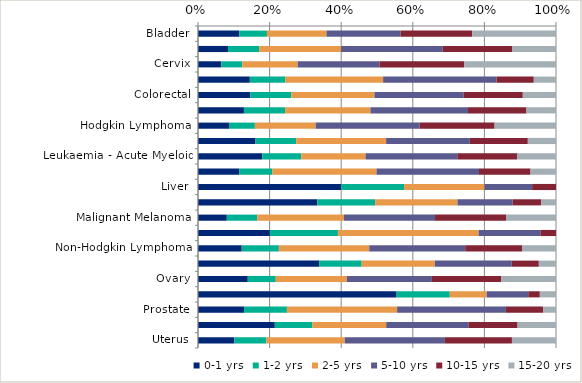
| Category | 0-1 yrs | 1-2 yrs | 2-5 yrs | 5-10 yrs | 10-15 yrs | 15-20 yrs |
|---|---|---|---|---|---|---|
| Bladder | 0.115 | 0.077 | 0.166 | 0.207 | 0.2 | 0.234 |
| Breast | 0.084 | 0.088 | 0.228 | 0.284 | 0.193 | 0.123 |
| Cervix | 0.065 | 0.059 | 0.155 | 0.228 | 0.237 | 0.256 |
| Central Nervous System (including Brain) | 0.145 | 0.099 | 0.273 | 0.317 | 0.104 | 0.062 |
| Colorectal | 0.146 | 0.115 | 0.232 | 0.249 | 0.165 | 0.093 |
| Head and Neck | 0.128 | 0.115 | 0.239 | 0.273 | 0.163 | 0.082 |
| Hodgkin Lymphoma | 0.087 | 0.072 | 0.17 | 0.291 | 0.209 | 0.171 |
| Kidney and unspecified urinary organs | 0.161 | 0.114 | 0.251 | 0.234 | 0.162 | 0.079 |
| Leukaemia - Acute Myeloid | 0.179 | 0.109 | 0.179 | 0.256 | 0.167 | 0.109 |
| Leukaemia - Chronic Lymphocytic | 0.115 | 0.093 | 0.291 | 0.286 | 0.144 | 0.071 |
| Liver | 0.4 | 0.176 | 0.224 | 0.133 | 0.067 | 0 |
| Lung | 0.333 | 0.162 | 0.23 | 0.154 | 0.08 | 0.041 |
| Malignant Melanoma | 0.08 | 0.085 | 0.242 | 0.255 | 0.199 | 0.138 |
| Multiple Myeloma | 0.201 | 0.19 | 0.393 | 0.172 | 0.044 | 0 |
| Non-Hodgkin Lymphoma | 0.122 | 0.104 | 0.253 | 0.268 | 0.159 | 0.095 |
| Oesophagus | 0.338 | 0.119 | 0.205 | 0.215 | 0.076 | 0.048 |
| Ovary | 0.139 | 0.078 | 0.199 | 0.237 | 0.193 | 0.153 |
| Pancreas | 0.555 | 0.148 | 0.103 | 0.116 | 0.032 | 0.045 |
| Prostate | 0.129 | 0.12 | 0.308 | 0.304 | 0.104 | 0.036 |
| Stomach | 0.215 | 0.105 | 0.206 | 0.23 | 0.137 | 0.107 |
| Uterus | 0.102 | 0.09 | 0.219 | 0.28 | 0.187 | 0.123 |